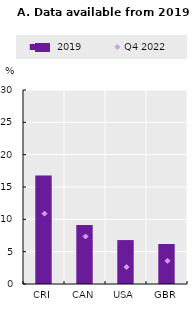
| Category | Q4 2019 |
|---|---|
| CRI | 16.789 |
| CAN | 9.113 |
| USA | 6.791 |
| GBR | 6.184 |